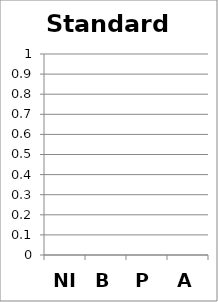
| Category | Standard 3 |
|---|---|
| NI | 0 |
| B | 0 |
| P | 0 |
| A | 0 |